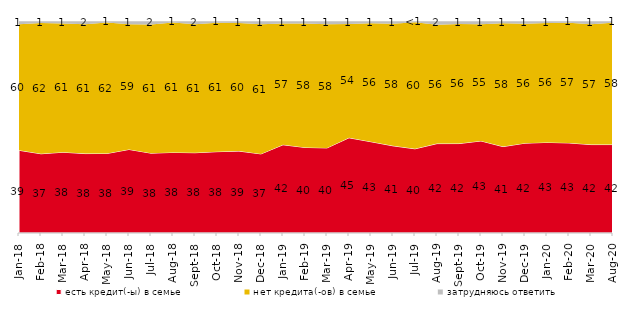
| Category | есть кредит(-ы) в семье | нет кредита(-ов) в семье | затрудняюсь ответить |
|---|---|---|---|
| 2018-01-01 | 39.05 | 59.5 | 1.45 |
| 2018-02-01 | 37.4 | 61.8 | 0.8 |
| 2018-03-01 | 38.15 | 60.8 | 1.05 |
| 2018-04-01 | 37.5 | 61 | 1.5 |
| 2018-05-01 | 37.55 | 61.8 | 0.65 |
| 2018-06-01 | 39.45 | 59.15 | 1.35 |
| 2018-07-01 | 37.7 | 60.7 | 1.6 |
| 2018-08-01 | 38.05 | 61.3 | 0.65 |
| 2018-09-01 | 37.9 | 60.6 | 1.5 |
| 2018-10-01 | 38.4 | 60.85 | 0.75 |
| 2018-11-01 | 38.673 | 60.479 | 0.848 |
| 2018-12-01 | 37.35 | 61.2 | 1.45 |
| 2019-01-01 | 41.65 | 57.3 | 1.05 |
| 2019-02-01 | 40.4 | 58.45 | 1.15 |
| 2019-03-01 | 40.179 | 58.379 | 1.442 |
| 2019-04-01 | 44.95 | 53.762 | 1.287 |
| 2019-05-01 | 43.091 | 55.968 | 0.941 |
| 2019-06-01 | 41.147 | 57.656 | 1.197 |
| 2019-07-01 | 39.752 | 59.752 | 0.495 |
| 2019-08-01 | 42.208 | 56.144 | 1.648 |
| 2019-09-01 | 42.228 | 56.485 | 1.287 |
| 2019-10-01 | 43.465 | 55.099 | 1.436 |
| 2019-11-01 | 40.792 | 58.218 | 0.99 |
| 2019-12-01 | 42.426 | 56.386 | 1.188 |
| 2020-01-01 | 42.772 | 56.337 | 0.891 |
| 2020-02-01 | 42.525 | 56.782 | 0.693 |
| 2020-03-01 | 41.745 | 56.817 | 1.438 |
| 2020-08-01 | 41.758 | 57.597 | 0.645 |